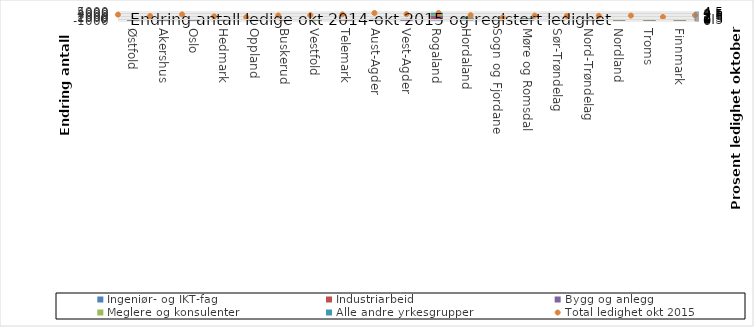
| Category | Ingeniør- og IKT-fag | Industriarbeid | Bygg og anlegg | Meglere og konsulenter | Alle andre yrkesgrupper |
|---|---|---|---|---|---|
| Østfold | 42 | 50 | -57 | 16 | -266 |
| Akershus | 205 | 20 | -53 | 16 | -25 |
| Oslo | 254 | -24 | 11 | 50 | -389 |
| Hedmark | 4 | 36 | -71 | 5 | -289 |
| Oppland | 1 | -2 | 22 | 15 | -72 |
| Buskerud | 87 | 34 | 20 | 17 | -186 |
| Vestfold | 84 | 29 | -41 | -17 | -152 |
| Telemark | 28 | 24 | 27 | 6 | -153 |
| Aust-Agder | 85 | 232 | 72 | 29 | 57 |
| Vest-Agder | 154 | 202 | -8 | 19 | 112 |
| Rogaland | 1036 | 1080 | 921 | 198 | 1297 |
| Hordaland | 480 | 526 | 285 | 81 | 371 |
| Sogn og Fjordane | 12 | 50 | 21 | 5 | -5 |
| Møre og Romsdal | 169 | 340 | 192 | 29 | 258 |
| Sør-Trøndelag | 144 | 129 | 4 | -1 | 67 |
| Nord-Trøndelag | 38 | 79 | 25 | 6 | -102 |
| Nordland | 26 | 11 | 8 | 12 | -63 |
| Troms | 38 | -1 | 24 | 10 | -39 |
| Finnmark | 12 | 12 | -11 | 3 | -72 |